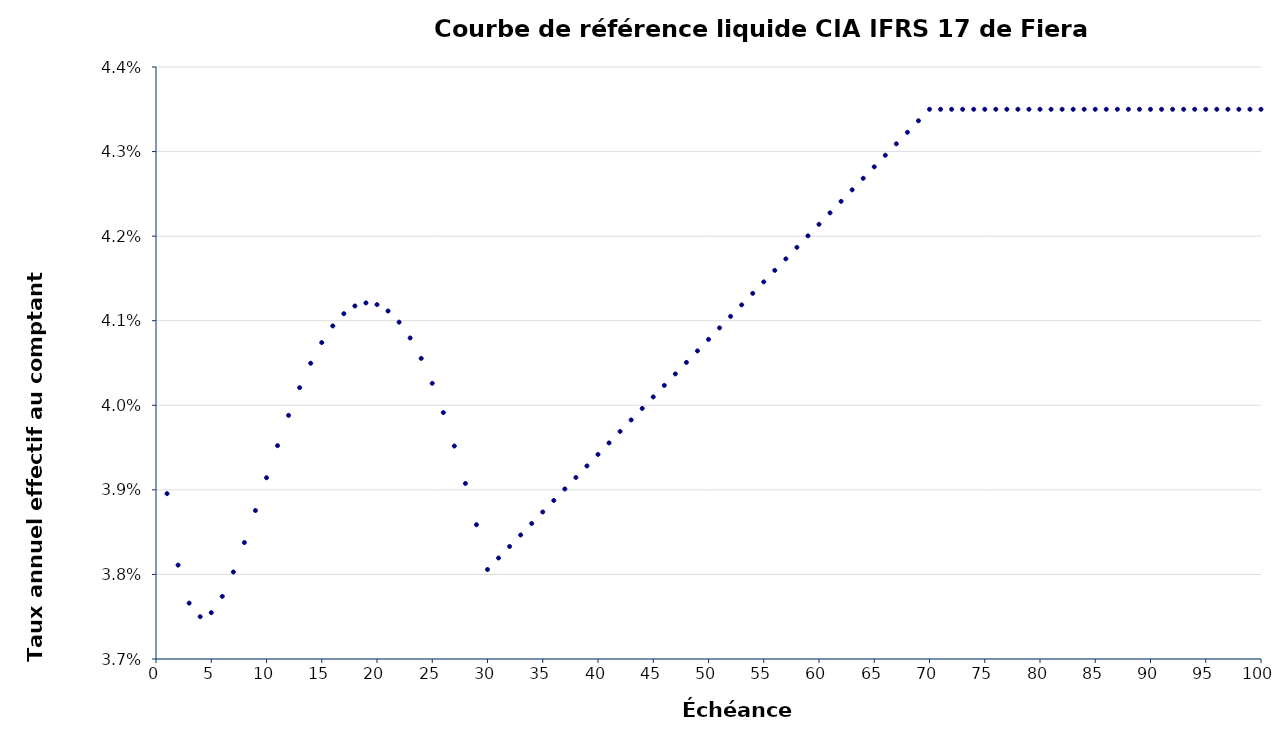
| Category | Taux annuel effectif au comptant (spot) |
|---|---|
| 1.0 | 0.039 |
| 2.0 | 0.038 |
| 3.0 | 0.038 |
| 4.0 | 0.038 |
| 5.0 | 0.038 |
| 6.0 | 0.038 |
| 7.0 | 0.038 |
| 8.0 | 0.038 |
| 9.0 | 0.039 |
| 10.0 | 0.039 |
| 11.0 | 0.04 |
| 12.0 | 0.04 |
| 13.0 | 0.04 |
| 14.0 | 0.04 |
| 15.0 | 0.041 |
| 16.0 | 0.041 |
| 17.0 | 0.041 |
| 18.0 | 0.041 |
| 19.0 | 0.041 |
| 20.0 | 0.041 |
| 21.0 | 0.041 |
| 22.0 | 0.041 |
| 23.0 | 0.041 |
| 24.0 | 0.041 |
| 25.0 | 0.04 |
| 26.0 | 0.04 |
| 27.0 | 0.04 |
| 28.0 | 0.039 |
| 29.0 | 0.039 |
| 30.0 | 0.038 |
| 31.0 | 0.038 |
| 32.0 | 0.038 |
| 33.0 | 0.038 |
| 34.0 | 0.039 |
| 35.0 | 0.039 |
| 36.0 | 0.039 |
| 37.0 | 0.039 |
| 38.0 | 0.039 |
| 39.0 | 0.039 |
| 40.0 | 0.039 |
| 41.0 | 0.04 |
| 42.0 | 0.04 |
| 43.0 | 0.04 |
| 44.0 | 0.04 |
| 45.0 | 0.04 |
| 46.0 | 0.04 |
| 47.0 | 0.04 |
| 48.0 | 0.041 |
| 49.0 | 0.041 |
| 50.0 | 0.041 |
| 51.0 | 0.041 |
| 52.0 | 0.041 |
| 53.0 | 0.041 |
| 54.0 | 0.041 |
| 55.0 | 0.041 |
| 56.0 | 0.042 |
| 57.0 | 0.042 |
| 58.0 | 0.042 |
| 59.0 | 0.042 |
| 60.0 | 0.042 |
| 61.0 | 0.042 |
| 62.0 | 0.042 |
| 63.0 | 0.043 |
| 64.0 | 0.043 |
| 65.0 | 0.043 |
| 66.0 | 0.043 |
| 67.0 | 0.043 |
| 68.0 | 0.043 |
| 69.0 | 0.043 |
| 70.0 | 0.044 |
| 71.0 | 0.044 |
| 72.0 | 0.044 |
| 73.0 | 0.044 |
| 74.0 | 0.044 |
| 75.0 | 0.044 |
| 76.0 | 0.044 |
| 77.0 | 0.044 |
| 78.0 | 0.044 |
| 79.0 | 0.044 |
| 80.0 | 0.044 |
| 81.0 | 0.044 |
| 82.0 | 0.044 |
| 83.0 | 0.044 |
| 84.0 | 0.044 |
| 85.0 | 0.044 |
| 86.0 | 0.044 |
| 87.0 | 0.044 |
| 88.0 | 0.044 |
| 89.0 | 0.044 |
| 90.0 | 0.044 |
| 91.0 | 0.044 |
| 92.0 | 0.044 |
| 93.0 | 0.044 |
| 94.0 | 0.044 |
| 95.0 | 0.044 |
| 96.0 | 0.044 |
| 97.0 | 0.044 |
| 98.0 | 0.044 |
| 99.0 | 0.044 |
| 100.0 | 0.044 |